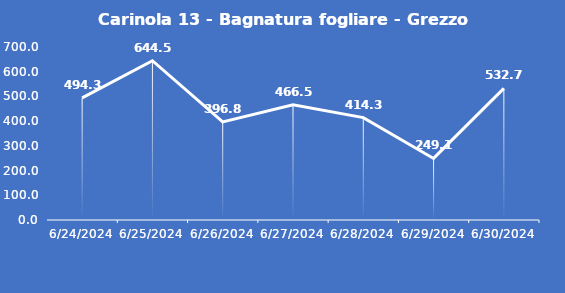
| Category | Carinola 13 - Bagnatura fogliare - Grezzo (min) |
|---|---|
| 6/24/24 | 494.3 |
| 6/25/24 | 644.5 |
| 6/26/24 | 396.8 |
| 6/27/24 | 466.5 |
| 6/28/24 | 414.3 |
| 6/29/24 | 249.1 |
| 6/30/24 | 532.7 |